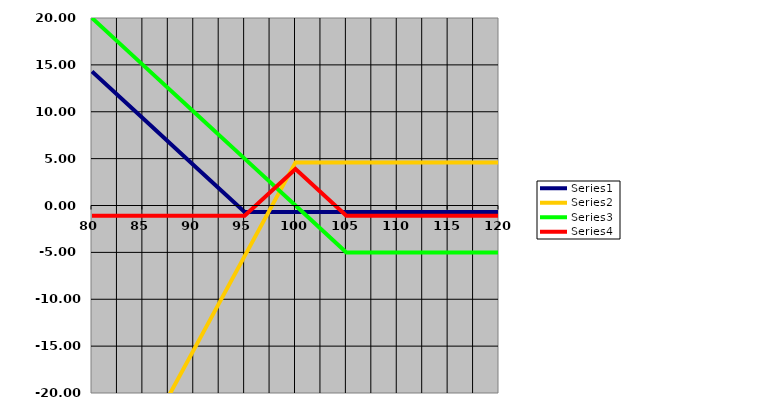
| Category | Series1 | Series2 | Series3 | Series4 |
|---|---|---|---|---|
| 80.0 | 14.3 | -35.4 | 20 | -1.1 |
| 85.0 | 9.3 | -25.4 | 15 | -1.1 |
| 90.0 | 4.3 | -15.4 | 10 | -1.1 |
| 95.0 | -0.7 | -5.4 | 5 | -1.1 |
| 100.0 | -0.7 | 4.6 | 0 | 3.9 |
| 105.0 | -0.7 | 4.6 | -5 | -1.1 |
| 110.0 | -0.7 | 4.6 | -5 | -1.1 |
| 115.0 | -0.7 | 4.6 | -5 | -1.1 |
| 120.0 | -0.7 | 4.6 | -5 | -1.1 |